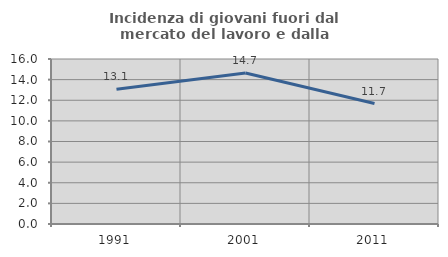
| Category | Incidenza di giovani fuori dal mercato del lavoro e dalla formazione  |
|---|---|
| 1991.0 | 13.07 |
| 2001.0 | 14.651 |
| 2011.0 | 11.682 |